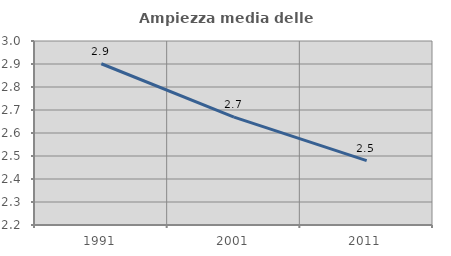
| Category | Ampiezza media delle famiglie |
|---|---|
| 1991.0 | 2.901 |
| 2001.0 | 2.669 |
| 2011.0 | 2.48 |